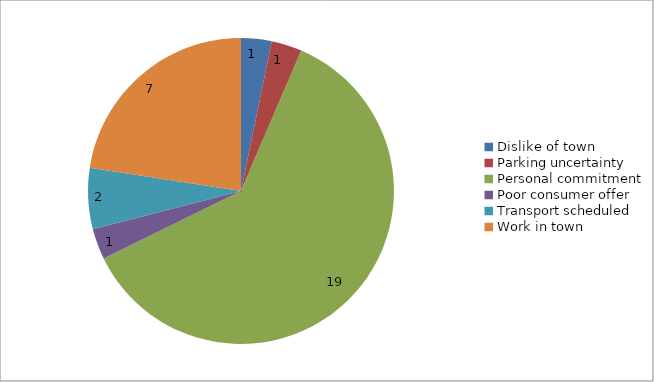
| Category | Series 0 |
|---|---|
| Dislike of town | 1 |
| Parking uncertainty | 1 |
| Personal commitment | 19 |
| Poor consumer offer | 1 |
| Transport scheduled | 2 |
| Work in town | 7 |